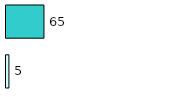
| Category | Series 0 | Series 1 |
|---|---|---|
| 0 | 5 | 65 |